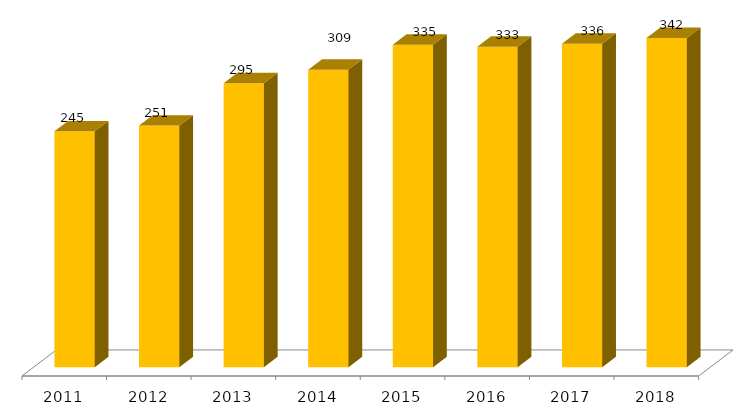
| Category | Categoria/Ano |
|---|---|
| 2011.0 | 245 |
| 2012.0 | 251 |
| 2013.0 | 295 |
| 2014.0 | 309 |
| 2015.0 | 335 |
| 2016.0 | 333 |
| 2017.0 | 336 |
| 2018.0 | 342 |